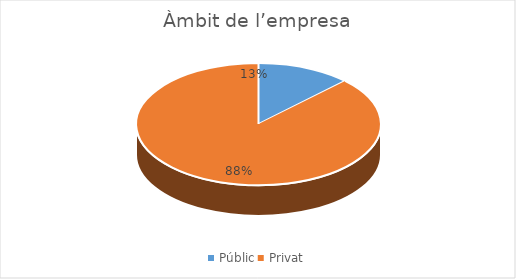
| Category | Series 0 |
|---|---|
| Públic | 1 |
| Privat | 7 |